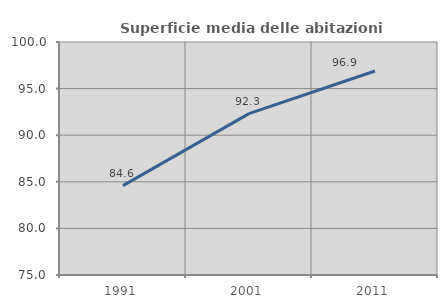
| Category | Superficie media delle abitazioni occupate |
|---|---|
| 1991.0 | 84.594 |
| 2001.0 | 92.318 |
| 2011.0 | 96.89 |